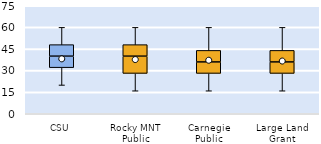
| Category | 25th | 50th | 75th |
|---|---|---|---|
| CSU | 32 | 8 | 8 |
| Rocky MNT Public | 28 | 12 | 8 |
| Carnegie Public | 28 | 8 | 8 |
| Large Land Grant | 28 | 8 | 8 |